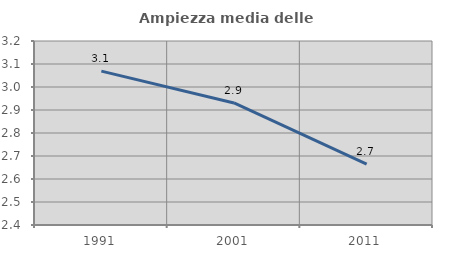
| Category | Ampiezza media delle famiglie |
|---|---|
| 1991.0 | 3.069 |
| 2001.0 | 2.931 |
| 2011.0 | 2.664 |